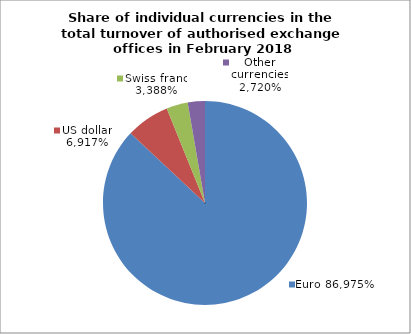
| Category | EUR |
|---|---|
| 0 | 0.87 |
| 1 | 0.069 |
| 2 | 0.034 |
| 3 | 0.027 |